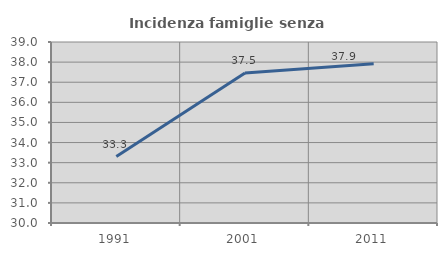
| Category | Incidenza famiglie senza nuclei |
|---|---|
| 1991.0 | 33.304 |
| 2001.0 | 37.454 |
| 2011.0 | 37.919 |